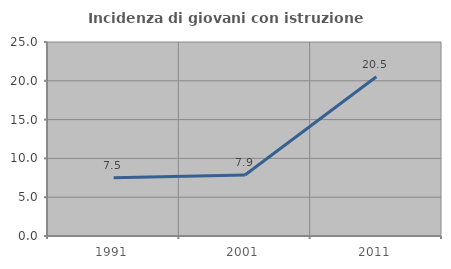
| Category | Incidenza di giovani con istruzione universitaria |
|---|---|
| 1991.0 | 7.5 |
| 2001.0 | 7.865 |
| 2011.0 | 20.513 |